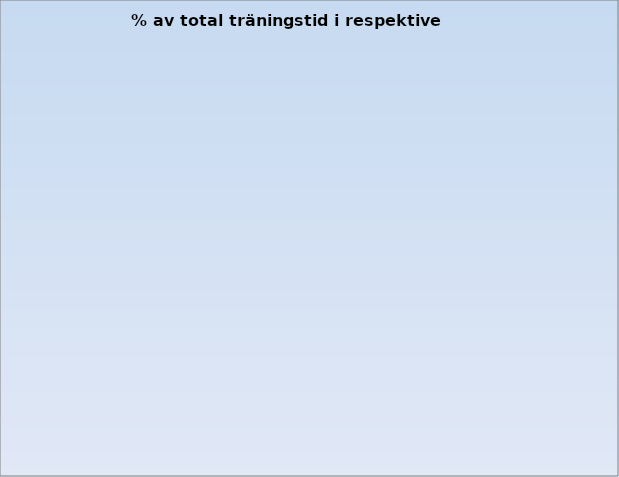
| Category | Series 0 |
|---|---|
| 1.0 | 0 |
| 2.0 | 0 |
| 3.0 | 0 |
| 4.0 | 0 |
| 5.0 | 0 |
| 6.0 | 0 |